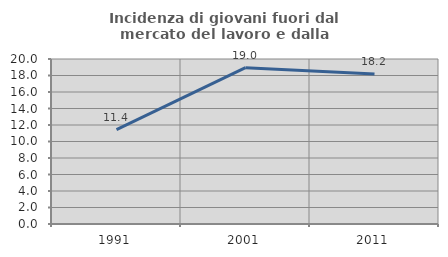
| Category | Incidenza di giovani fuori dal mercato del lavoro e dalla formazione  |
|---|---|
| 1991.0 | 11.441 |
| 2001.0 | 18.954 |
| 2011.0 | 18.182 |